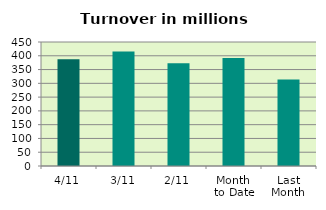
| Category | Series 0 |
|---|---|
| 4/11 | 387.457 |
| 3/11 | 415.669 |
| 2/11 | 373 |
| Month 
to Date | 392.042 |
| Last
Month | 314.143 |